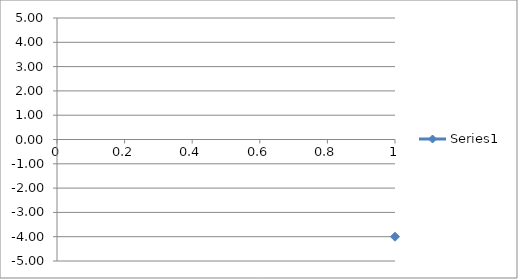
| Category | Series 0 |
|---|---|
| 0 | -4.002 |
| 1 | -3.003 |
| 2 | -2.802 |
| 3 | -2.003 |
| 4 | -1.002 |
| 5 | -0.004 |
| 6 | 0.996 |
| 7 | 1.997 |
| 8 | 2.796 |
| 9 | 2.998 |
| 10 | 3.996 |
| 11 | 2.998 |
| 12 | 2.796 |
| 13 | 1.998 |
| 14 | 0.996 |
| 15 | -0.004 |
| 16 | -1.002 |
| 17 | -2.002 |
| 18 | -2.802 |
| 19 | -3.003 |
| 20 | -4.002 |